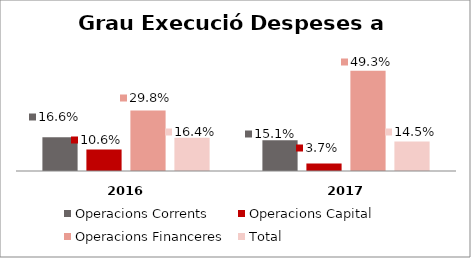
| Category | Operacions Corrents | Operacions Capital | Operacions Financeres | Total |
|---|---|---|---|---|
| 0 | 0.166 | 0.106 | 0.298 | 0.164 |
| 1 | 0.151 | 0.037 | 0.493 | 0.145 |